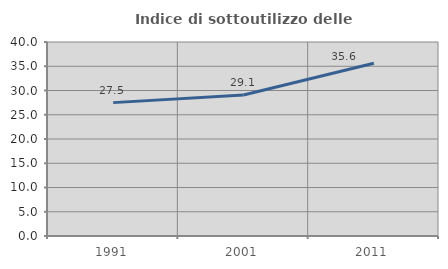
| Category | Indice di sottoutilizzo delle abitazioni  |
|---|---|
| 1991.0 | 27.5 |
| 2001.0 | 29.075 |
| 2011.0 | 35.625 |